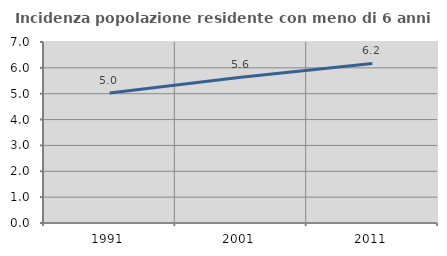
| Category | Incidenza popolazione residente con meno di 6 anni |
|---|---|
| 1991.0 | 5.03 |
| 2001.0 | 5.637 |
| 2011.0 | 6.172 |